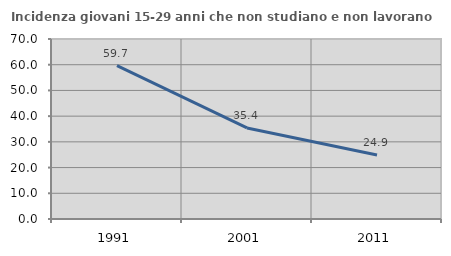
| Category | Incidenza giovani 15-29 anni che non studiano e non lavorano  |
|---|---|
| 1991.0 | 59.66 |
| 2001.0 | 35.417 |
| 2011.0 | 24.855 |